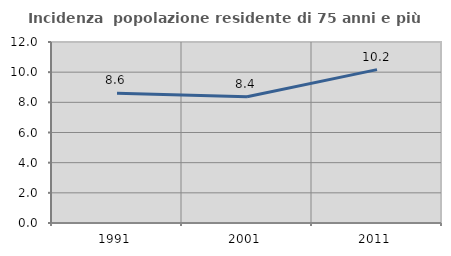
| Category | Incidenza  popolazione residente di 75 anni e più |
|---|---|
| 1991.0 | 8.602 |
| 2001.0 | 8.366 |
| 2011.0 | 10.168 |